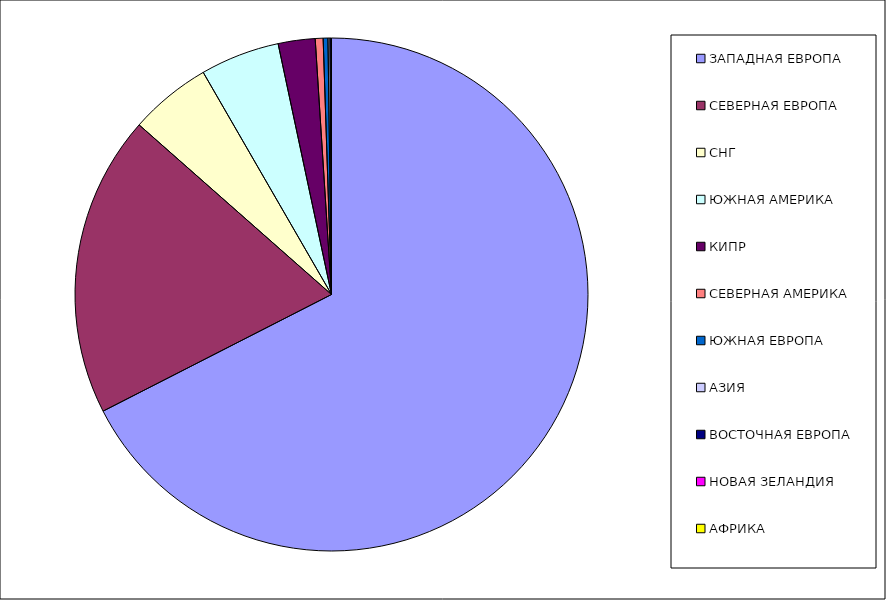
| Category | Оборот |
|---|---|
| ЗАПАДНАЯ ЕВРОПА | 0.675 |
| СЕВЕРНАЯ ЕВРОПА | 0.19 |
| СНГ | 0.052 |
| ЮЖНАЯ АМЕРИКА | 0.05 |
| КИПР | 0.023 |
| СЕВЕРНАЯ АМЕРИКА | 0.005 |
| ЮЖНАЯ ЕВРОПА | 0.003 |
| АЗИЯ | 0.001 |
| ВОСТОЧНАЯ ЕВРОПА | 0.001 |
| НОВАЯ ЗЕЛАНДИЯ | 0 |
| АФРИКА | 0 |